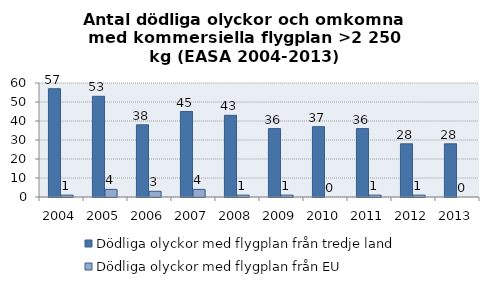
| Category | Dödliga olyckor med flygplan från tredje land | Dödliga olyckor med flygplan från EU |
|---|---|---|
| 2004.0 | 57 | 1 |
| 2005.0 | 53 | 4 |
| 2006.0 | 38 | 3 |
| 2007.0 | 45 | 4 |
| 2008.0 | 43 | 1 |
| 2009.0 | 36 | 1 |
| 2010.0 | 37 | 0 |
| 2011.0 | 36 | 1 |
| 2012.0 | 28 | 1 |
| 2013.0 | 28 | 0 |